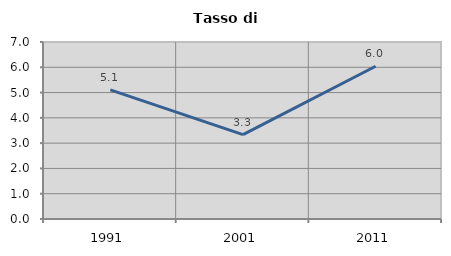
| Category | Tasso di disoccupazione   |
|---|---|
| 1991.0 | 5.105 |
| 2001.0 | 3.337 |
| 2011.0 | 6.04 |